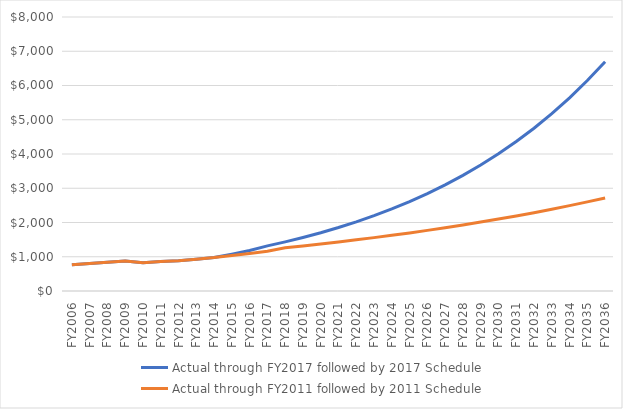
| Category | Actual through FY2017 followed by 2017 Schedule | Actual through FY2011 followed by 2011 Schedule |
|---|---|---|
| FY2006 | 763.545 | 763.545 |
| FY2007 | 799.785 | 799.785 |
| FY2008 | 837.761 | 837.761 |
| FY2009 | 877.535 | 877.535 |
| FY2010 | 824.583 | 824.583 |
| FY2011 | 863.638 | 863.638 |
| FY2012 | 885.322 | 885.322 |
| FY2013 | 929.648 | 929.648 |
| FY2014 | 976.37 | 976.37 |
| FY2015 | 1074.007 | 1035.072 |
| FY2016 | 1181.228 | 1096.769 |
| FY2017 | 1316.662 | 1162.659 |
| FY2018 | 1434.304 | 1260.686 |
| FY2019 | 1562.463 | 1315.181 |
| FY2020 | 1702.073 | 1372.081 |
| FY2021 | 1854.158 | 1431.491 |
| FY2022 | 2019.832 | 1493.528 |
| FY2023 | 2200.309 | 1558.309 |
| FY2024 | 2396.912 | 1625.958 |
| FY2025 | 2611.083 | 1696.606 |
| FY2026 | 2844.444 | 1770.388 |
| FY2027 | 3098.543 | 1847.447 |
| FY2028 | 3375.406 | 1927.931 |
| FY2029 | 3677.008 | 2011.997 |
| FY2030 | 4005.558 | 2099.808 |
| FY2031 | 4363.465 | 2191.534 |
| FY2032 | 4753.352 | 2287.355 |
| FY2033 | 5178.076 | 2387.458 |
| FY2034 | 5640.751 | 2492.038 |
| FY2035 | 6144.767 | 2601.301 |
| FY2036 | 6693.818 | 2715.462 |